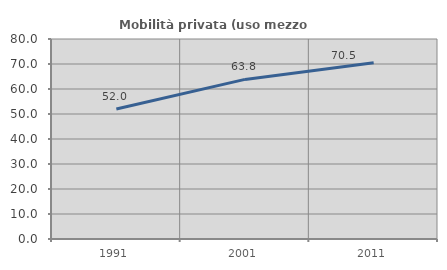
| Category | Mobilità privata (uso mezzo privato) |
|---|---|
| 1991.0 | 51.968 |
| 2001.0 | 63.844 |
| 2011.0 | 70.536 |